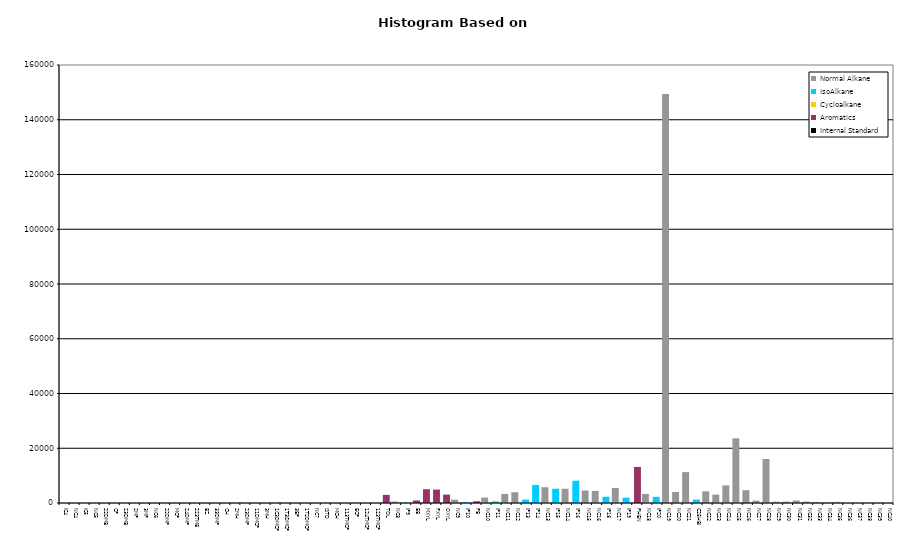
| Category | Normal Alkane | IsoAlkane | Cycloalkane | Aromatics | Internal Standard |
|---|---|---|---|---|---|
| IC4 | 0 | 0 | 0 | 0 | 0 |
| NC4 | 0 | 0 | 0 | 0 | 0 |
| IC5 | 0 | 0 | 0 | 0 | 0 |
| NC5 | 0 | 0 | 0 | 0 | 0 |
| 22DMB | 0 | 0 | 0 | 0 | 0 |
| CP | 0 | 0 | 0 | 0 | 0 |
| 23DMB | 0 | 0 | 0 | 0 | 0 |
| 2MP | 0 | 0 | 0 | 0 | 0 |
| 3MP | 0 | 0 | 0 | 0 | 0 |
| NC6 | 0 | 0 | 0 | 0 | 0 |
| 22DMP | 0 | 0 | 0 | 0 | 0 |
| MCP | 0 | 0 | 0 | 0 | 0 |
| 24DMP | 0 | 0 | 0 | 0 | 0 |
| 223TMB | 0 | 0 | 0 | 0 | 0 |
| BZ | 0 | 0 | 0 | 0 | 0 |
| 33DMP | 0 | 0 | 0 | 0 | 0 |
| CH | 0 | 0 | 0 | 0 | 0 |
| 2MH | 0 | 0 | 0 | 0 | 0 |
| 23DMP | 0 | 0 | 0 | 0 | 0 |
| 11DMCP | 0 | 0 | 0 | 0 | 0 |
| 3MH | 0 | 0 | 0 | 0 | 0 |
| 1C3DMCP | 0 | 0 | 0 | 0 | 0 |
| 1T3DMCP | 0 | 0 | 0 | 0 | 0 |
| 3EP | 0 | 0 | 0 | 0 | 0 |
| 1T2DMCP | 0 | 0 | 0 | 0 | 0 |
| NC7 | 0 | 0 | 0 | 0 | 0 |
| ISTD | 0 | 0 | 0 | 0 | 0 |
| MCH | 0 | 0 | 163 | 0 | 0 |
| 113TMCP | 0 | 0 | 0 | 0 | 0 |
| ECP | 0 | 0 | 0 | 0 | 0 |
| 124TMCP | 0 | 0 | 0 | 0 | 0 |
| 123TMCP | 0 | 0 | 0 | 0 | 0 |
| TOL | 0 | 0 | 0 | 2976 | 0 |
| NC8 | 550 | 0 | 0 | 0 | 0 |
| IP9 | 0 | 211 | 0 | 0 | 0 |
| EB | 0 | 0 | 0 | 922 | 0 |
| MXYL | 0 | 0 | 0 | 5041 | 0 |
| PXYL | 0 | 0 | 0 | 4909 | 0 |
| OXYL | 0 | 0 | 0 | 3062 | 0 |
| NC9 | 1202 | 0 | 0 | 0 | 0 |
| IP10 | 0 | 364 | 0 | 0 | 0 |
| PB | 0 | 0 | 0 | 640 | 0 |
| NC10 | 1987 | 0 | 0 | 0 | 0 |
| IP11 | 0 | 579 | 0 | 0 | 0 |
| NC11 | 3324 | 0 | 0 | 0 | 0 |
| NC12 | 3935 | 0 | 0 | 0 | 0 |
| IP13 | 0 | 1246 | 0 | 0 | 0 |
| IP14 | 0 | 6597 | 0 | 0 | 0 |
| NC13 | 5761 | 0 | 0 | 0 | 0 |
| IP15 | 0 | 5208 | 0 | 0 | 0 |
| NC14 | 5200 | 0 | 0 | 0 | 0 |
| IP16 | 0 | 8142 | 0 | 0 | 0 |
| NC15 | 4570 | 0 | 0 | 0 | 0 |
| NC16 | 4431 | 0 | 0 | 0 | 0 |
| IP18 | 0 | 2285 | 0 | 0 | 0 |
| NC17 | 5506 | 0 | 0 | 0 | 0 |
| IP19 | 0 | 1955 | 0 | 0 | 0 |
| PHEN | 0 | 0 | 0 | 13176 | 0 |
| NC18 | 3317 | 0 | 0 | 0 | 0 |
| IP20 | 0 | 2253 | 0 | 0 | 0 |
| NC19 | 149367 | 0 | 0 | 0 | 0 |
| NC20 | 4006 | 0 | 0 | 0 | 0 |
| NC21 | 11284 | 0 | 0 | 0 | 0 |
| C25HBI | 0 | 1275 | 0 | 0 | 0 |
| NC22 | 4276 | 0 | 0 | 0 | 0 |
| NC23 | 3064 | 0 | 0 | 0 | 0 |
| NC24 | 6436 | 0 | 0 | 0 | 0 |
| NC25 | 23624 | 0 | 0 | 0 | 0 |
| NC26 | 4685 | 0 | 0 | 0 | 0 |
| NC27 | 851 | 0 | 0 | 0 | 0 |
| NC28 | 16075 | 0 | 0 | 0 | 0 |
| NC29 | 475 | 0 | 0 | 0 | 0 |
| NC30 | 501 | 0 | 0 | 0 | 0 |
| NC31 | 906 | 0 | 0 | 0 | 0 |
| NC32 | 539 | 0 | 0 | 0 | 0 |
| NC33 | 379 | 0 | 0 | 0 | 0 |
| NC34 | 204 | 0 | 0 | 0 | 0 |
| NC35 | 387 | 0 | 0 | 0 | 0 |
| NC36 | 0 | 0 | 0 | 0 | 0 |
| NC37 | 0 | 0 | 0 | 0 | 0 |
| NC38 | 0 | 0 | 0 | 0 | 0 |
| NC39 | 0 | 0 | 0 | 0 | 0 |
| NC40 | 0 | 0 | 0 | 0 | 0 |